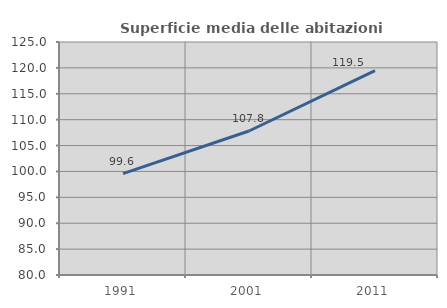
| Category | Superficie media delle abitazioni occupate |
|---|---|
| 1991.0 | 99.579 |
| 2001.0 | 107.812 |
| 2011.0 | 119.488 |